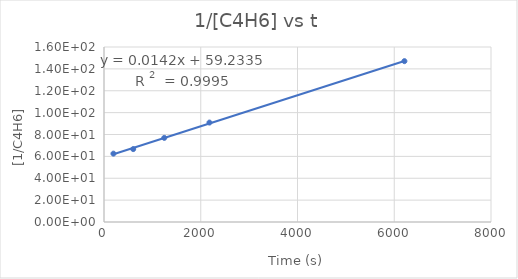
| Category | Series 0 |
|---|---|
| 195.0 | 62.5 |
| 604.0 | 66.667 |
| 1246.0 | 76.923 |
| 2180.0 | 90.909 |
| 6210.0 | 147.059 |